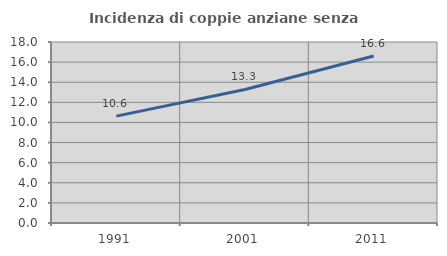
| Category | Incidenza di coppie anziane senza figli  |
|---|---|
| 1991.0 | 10.629 |
| 2001.0 | 13.281 |
| 2011.0 | 16.612 |